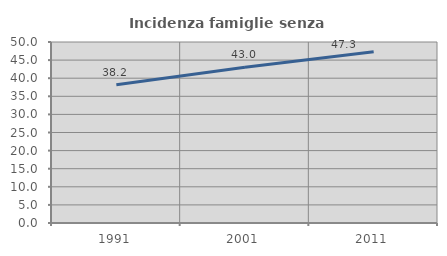
| Category | Incidenza famiglie senza nuclei |
|---|---|
| 1991.0 | 38.182 |
| 2001.0 | 43.03 |
| 2011.0 | 47.305 |